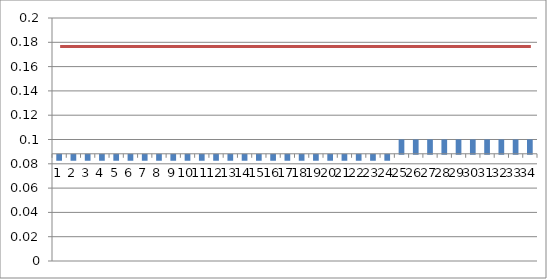
| Category | Series 0 |
|---|---|
| 0 | 0.083 |
| 1 | 0.083 |
| 2 | 0.083 |
| 3 | 0.083 |
| 4 | 0.083 |
| 5 | 0.083 |
| 6 | 0.083 |
| 7 | 0.083 |
| 8 | 0.083 |
| 9 | 0.083 |
| 10 | 0.083 |
| 11 | 0.083 |
| 12 | 0.083 |
| 13 | 0.083 |
| 14 | 0.083 |
| 15 | 0.083 |
| 16 | 0.083 |
| 17 | 0.083 |
| 18 | 0.083 |
| 19 | 0.083 |
| 20 | 0.083 |
| 21 | 0.083 |
| 22 | 0.083 |
| 23 | 0.083 |
| 24 | 0.1 |
| 25 | 0.1 |
| 26 | 0.1 |
| 27 | 0.1 |
| 28 | 0.1 |
| 29 | 0.1 |
| 30 | 0.1 |
| 31 | 0.1 |
| 32 | 0.1 |
| 33 | 0.1 |